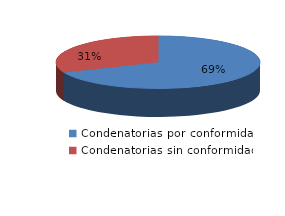
| Category | Series 0 |
|---|---|
| 0 | 24 |
| 1 | 11 |